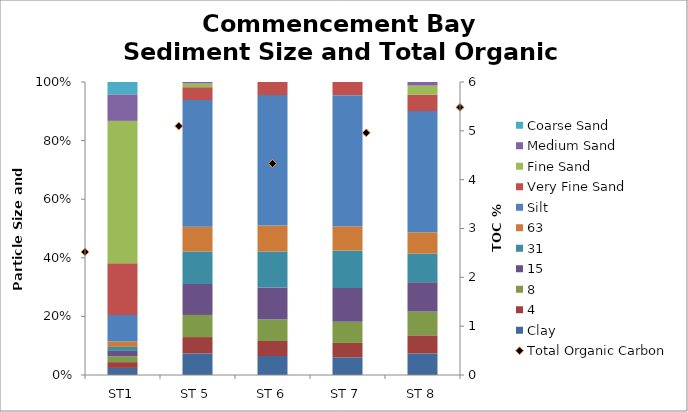
| Category | Clay | 4 | 8 | 15 | 31 | 63 | Silt | Very Fine Sand | Fine Sand | Medium Sand | Coarse Sand |
|---|---|---|---|---|---|---|---|---|---|---|---|
| ST1 | 2.65 |  |  |  |  |  | 9.95 | 19.4 | 53.4 | 9.95 | 4.63 |
| ST 5 | 12.95 |  |  |  |  |  | 76.215 | 7.69 | 2.205 | 0.915 | 0 |
| ST 6 | 11.7 |  |  |  |  |  | 80.33 | 8.07 | 0 | 0 | 0 |
| ST 7 | 10.9 |  |  |  |  |  | 80.94 | 8.11 | 0.004 | 0 | 0 |
| ST 8 | 12.5 |  |  |  |  |  | 70.535 | 9.49 | 5.335 | 2.095 | 0 |